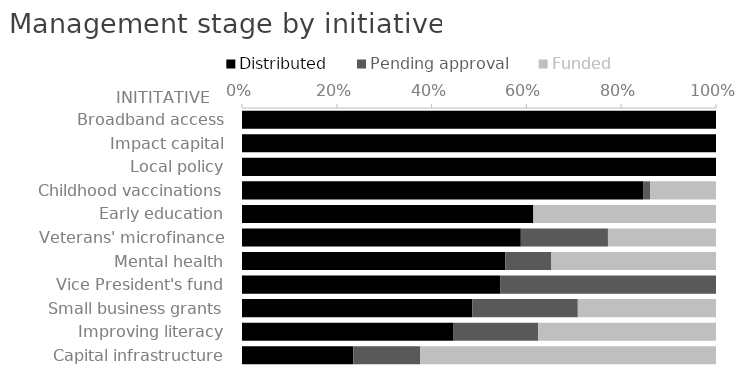
| Category | Distributed | Pending approval | Funded |
|---|---|---|---|
| Broadband access | 1 | 0 | 0 |
| Impact capital | 1 | 0 | 0 |
| Local policy | 1 | 0 | 0 |
| Childhood vaccinations | 0.846 | 0.015 | 0.138 |
| Early education | 0.615 | 0 | 0.385 |
| Veterans' microfinance | 0.588 | 0.184 | 0.228 |
| Mental health | 0.556 | 0.097 | 0.347 |
| Vice President's fund | 0.545 | 0.455 | 0 |
| Small business grants | 0.486 | 0.223 | 0.291 |
| Improving literacy | 0.446 | 0.179 | 0.375 |
| Capital infrastructure | 0.235 | 0.141 | 0.624 |